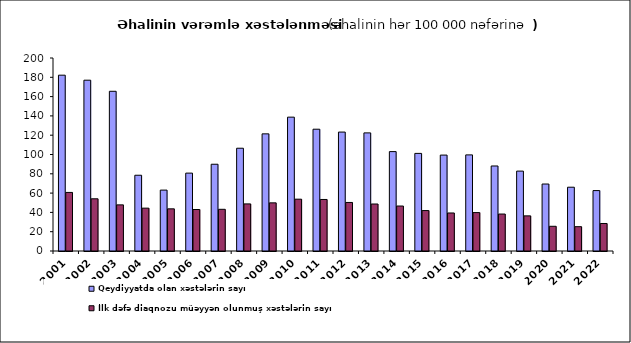
| Category | Qeydiyyatda olan xəstələrin sayı                                                                                             | İlk dəfə diaqnozu müəyyən olunmuş xəstələrin sayı   |
|---|---|---|
| 2001.0 | 182.2 | 60.7 |
| 2002.0 | 177 | 54.1 |
| 2003.0 | 165.5 | 47.8 |
| 2004.0 | 78.5 | 44.4 |
| 2005.0 | 63.1 | 43.7 |
| 2006.0 | 80.7 | 43 |
| 2007.0 | 89.9 | 43.2 |
| 2008.0 | 106.5 | 48.8 |
| 2009.0 | 121.4 | 49.9 |
| 2010.0 | 138.7 | 53.7 |
| 2011.0 | 126.2 | 53.4 |
| 2012.0 | 123.239 | 50.306 |
| 2013.0 | 122.4 | 48.7 |
| 2014.0 | 103 | 46.6 |
| 2015.0 | 101.141 | 41.9 |
| 2016.0 | 99.4 | 39.4 |
| 2017.0 | 99.6 | 39.8 |
| 2018.0 | 88.1 | 38.3 |
| 2019.0 | 82.8 | 36.4 |
| 2020.0 | 69.4 | 25.6 |
| 2021.0 | 66.1 | 25.2 |
| 2022.0 | 62.6 | 28.5 |